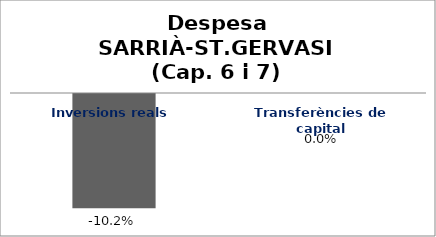
| Category | Series 0 |
|---|---|
| Inversions reals | -0.102 |
| Transferències de capital | 0 |